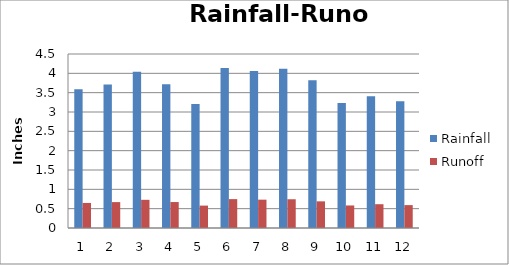
| Category | Rainfall | Runoff |
|---|---|---|
| 0 | 3.59 | 0.648 |
| 1 | 3.71 | 0.67 |
| 2 | 4.04 | 0.729 |
| 3 | 3.72 | 0.671 |
| 4 | 3.21 | 0.579 |
| 5 | 4.14 | 0.747 |
| 6 | 4.06 | 0.733 |
| 7 | 4.12 | 0.744 |
| 8 | 3.82 | 0.689 |
| 9 | 3.23 | 0.583 |
| 10 | 3.41 | 0.615 |
| 11 | 3.28 | 0.592 |